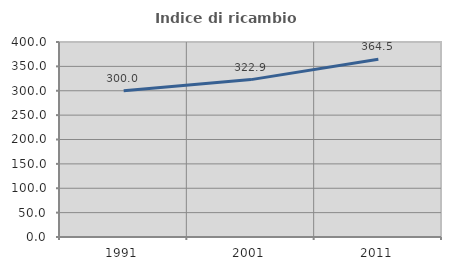
| Category | Indice di ricambio occupazionale  |
|---|---|
| 1991.0 | 300 |
| 2001.0 | 322.857 |
| 2011.0 | 364.516 |